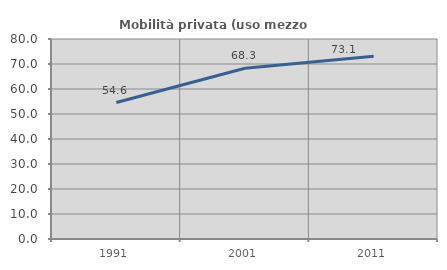
| Category | Mobilità privata (uso mezzo privato) |
|---|---|
| 1991.0 | 54.576 |
| 2001.0 | 68.306 |
| 2011.0 | 73.059 |